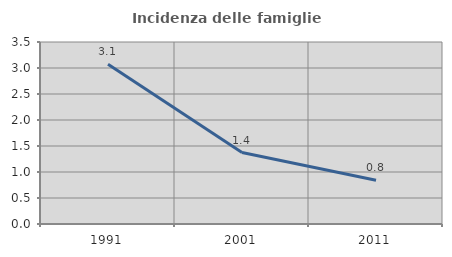
| Category | Incidenza delle famiglie numerose |
|---|---|
| 1991.0 | 3.072 |
| 2001.0 | 1.374 |
| 2011.0 | 0.84 |